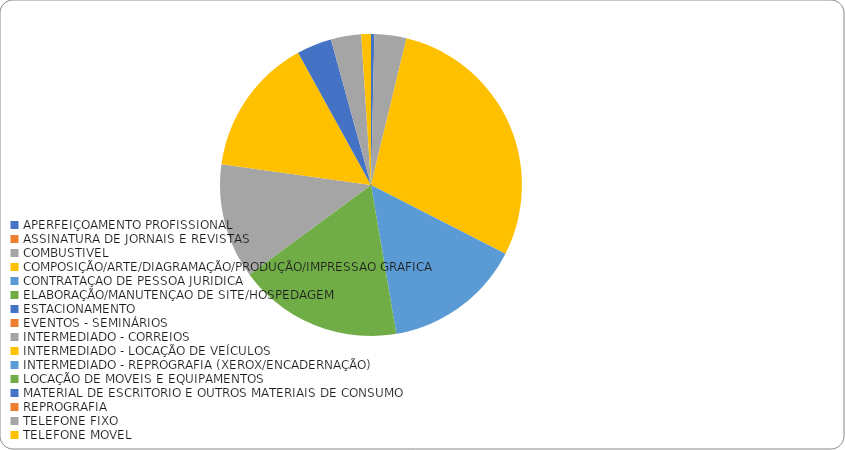
| Category | Series 0 |
|---|---|
| APERFEIÇOAMENTO PROFISSIONAL | 630 |
| ASSINATURA DE JORNAIS E REVISTAS | 0 |
| COMBUSTIVEL | 5965.703 |
| COMPOSIÇÃO/ARTE/DIAGRAMAÇÃO/PRODUÇÃO/IMPRESSAO GRAFICA | 50179.757 |
| CONTRATAÇAO DE PESSOA JURIDICA | 25824.333 |
| ELABORAÇÃO/MANUTENÇAO DE SITE/HOSPEDAGEM | 30688.6 |
| ESTACIONAMENTO | 0 |
| EVENTOS - SEMINÁRIOS | 0 |
| INTERMEDIADO - CORREIOS | 21456.97 |
| INTERMEDIADO - LOCAÇÃO DE VEÍCULOS | 25833.77 |
| INTERMEDIADO - REPROGRAFIA (XEROX/ENCADERNAÇÃO) | 0 |
| LOCAÇÃO DE MOVEIS E EQUIPAMENTOS | 0 |
| MATERIAL DE ESCRITORIO E OUTROS MATERIAIS DE CONSUMO | 6527.833 |
| REPROGRAFIA | 0 |
| TELEFONE FIXO | 5664.277 |
| TELEFONE MOVEL | 1802.153 |